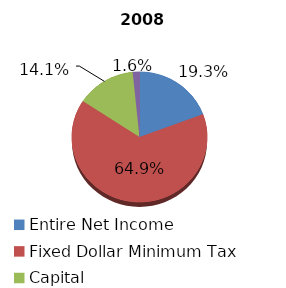
| Category | 2008 |
|---|---|
| Entire Net Income | 49309 |
| Fixed Dollar Minimum Tax | 165524 |
| Capital | 35989 |
| Alternative Minimum Taxable Income | 4120 |